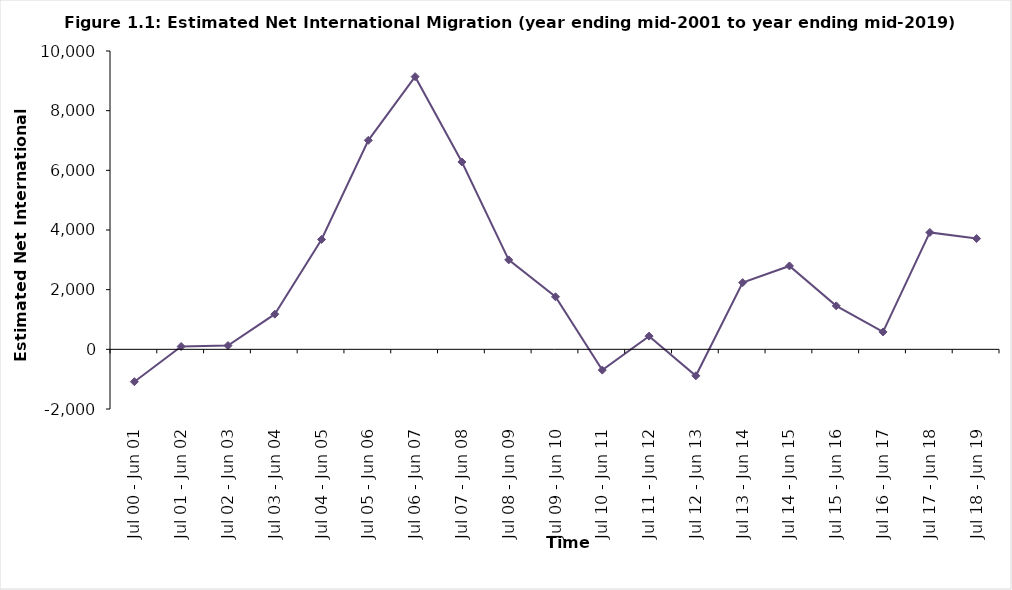
| Category | Net International Migration |
|---|---|
| Jul 00 - Jun 01 | -1085 |
| Jul 01 - Jun 02 | 95 |
| Jul 02 - Jun 03 | 127 |
| Jul 03 - Jun 04 | 1178 |
| Jul 04 - Jun 05 | 3683 |
| Jul 05 - Jun 06 | 7006 |
| Jul 06 - Jun 07 | 9140 |
| Jul 07 - Jun 08 | 6280 |
| Jul 08 - Jun 09 | 2998 |
| Jul 09 - Jun 10 | 1762 |
| Jul 10 - Jun 11 | -696 |
| Jul 11 - Jun 12 | 442 |
| Jul 12 - Jun 13 | -887 |
| Jul 13 - Jun 14 | 2237 |
| Jul 14 - Jun 15 | 2795 |
| Jul 15 - Jun 16 | 1458 |
| Jul 16 - Jun 17 | 583 |
| Jul 17 - Jun 18 | 3918 |
| Jul 18 - Jun 19 | 3713 |